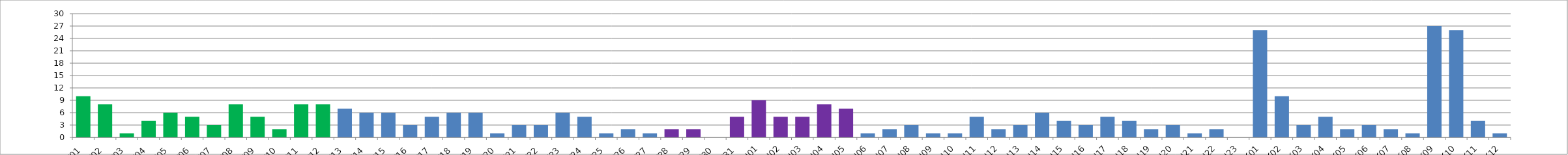
| Category | Series 0 |
|---|---|
| W01 | 10 |
| W02 | 8 |
| W03 | 1 |
| W04 | 4 |
| W05 | 6 |
| W06 | 5 |
| W07 | 3 |
| W08 | 8 |
| W09 | 5 |
| W10 | 2 |
| W11 | 8 |
| W12 | 8 |
| W13 | 7 |
| W14 | 6 |
| W15 | 6 |
| W16 | 3 |
| W17 | 5 |
| W18 | 6 |
| W19 | 6 |
| W20 | 1 |
| W21 | 3 |
| W22 | 3 |
| W23 | 6 |
| W24 | 5 |
| W25 | 1 |
| W26 | 2 |
| W27 | 1 |
| W28 | 2 |
| W29 | 2 |
| W30 | 0 |
| W31 | 5 |
| U01 | 9 |
| U02 | 5 |
| U03 | 5 |
| U04 | 8 |
| U05 | 7 |
| U06 | 1 |
| U07 | 2 |
| U08 | 3 |
| U09 | 1 |
| U10 | 1 |
| U11 | 5 |
| U12 | 2 |
| U13 | 3 |
| U14 | 6 |
| U15 | 4 |
| U16 | 3 |
| U17 | 5 |
| U18 | 4 |
| U19 | 2 |
| U20 | 3 |
| U21 | 1 |
| U22 | 2 |
| U23 | 0 |
| K01 | 26 |
| K02 | 10 |
| K03 | 3 |
| K04 | 5 |
| K05 | 2 |
| K06 | 3 |
| K07 | 2 |
| K08 | 1 |
| K09 | 27 |
| K10 | 26 |
| K11 | 4 |
| K12 | 1 |